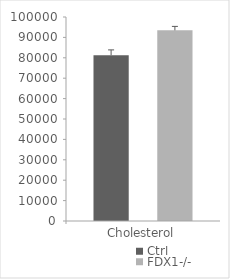
| Category | Ctrl | FDX1-/- |
|---|---|---|
| Cholesterol | 81276.071 | 93456.611 |